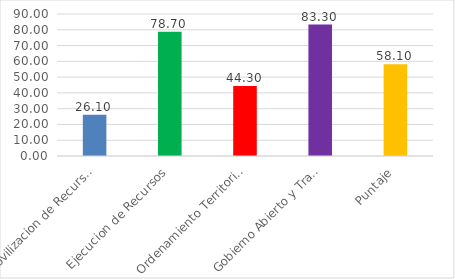
| Category | Series 0 |
|---|---|
| Movilizacion de Recursos | 26.1 |
| Ejecucion de Recursos | 78.7 |
| Ordenamiento Territorial | 44.3 |
| Gobierno Abierto y Transparencia | 83.3 |
| Puntaje | 58.1 |